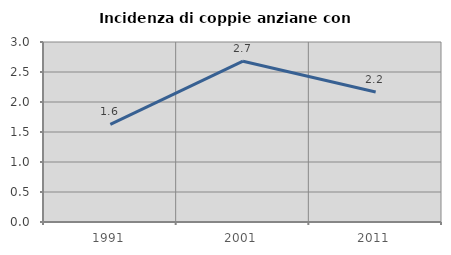
| Category | Incidenza di coppie anziane con figli |
|---|---|
| 1991.0 | 1.627 |
| 2001.0 | 2.68 |
| 2011.0 | 2.168 |